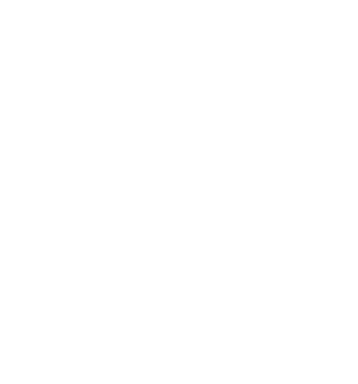
| Category | Men | Women |
|---|---|---|
| High risk sectors | 32.102 | 42.103 |
| Medium-high risk sectors | 12.011 | 10.945 |
| Medium risk sectors | 15.504 | 2.395 |
| Low-medium risk sectors | 38.641 | 40.414 |
| Low risk | 1.743 | 4.144 |